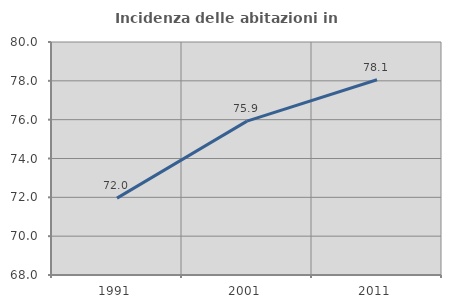
| Category | Incidenza delle abitazioni in proprietà  |
|---|---|
| 1991.0 | 71.959 |
| 2001.0 | 75.924 |
| 2011.0 | 78.058 |